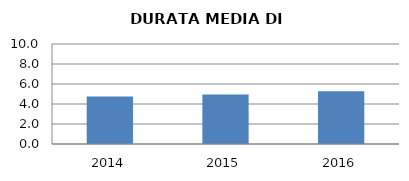
| Category | 2014 2015 2016 |
|---|---|
| 2014.0 | 4.75 |
| 2015.0 | 4.95 |
| 2016.0 | 5.286 |